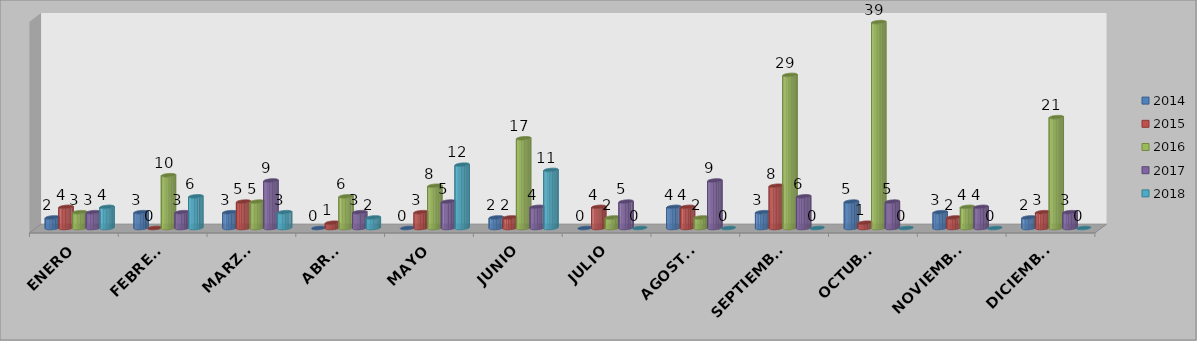
| Category | 2014 | 2015 | 2016 | 2017 | 2018 |
|---|---|---|---|---|---|
| ENERO | 2 | 4 | 3 | 3 | 4 |
| FEBRERO | 3 | 0 | 10 | 3 | 6 |
| MARZO  | 3 | 5 | 5 | 9 | 3 |
| ABRIL | 0 | 1 | 6 | 3 | 2 |
| MAYO | 0 | 3 | 8 | 5 | 12 |
| JUNIO | 2 | 2 | 17 | 4 | 11 |
| JULIO | 0 | 4 | 2 | 5 | 0 |
| AGOSTO | 4 | 4 | 2 | 9 | 0 |
| SEPTIEMBRE | 3 | 8 | 29 | 6 | 0 |
| OCTUBRE | 5 | 1 | 39 | 5 | 0 |
| NOVIEMBRE | 3 | 2 | 4 | 4 | 0 |
| DICIEMBRE | 2 | 3 | 21 | 3 | 0 |